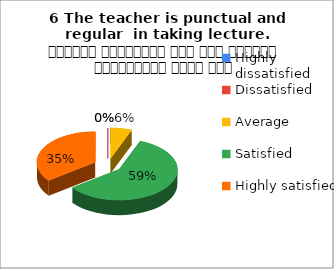
| Category | 6 The teacher is punctual and regular  in taking lecture. शिक्षक समयनिष्ठ हैं एवं नियमित व्याख्यान देते हैं |
|---|---|
| Highly dissatisfied | 0 |
| Dissatisfied | 0 |
| Average | 1 |
| Satisfied | 10 |
| Highly satisfied | 6 |